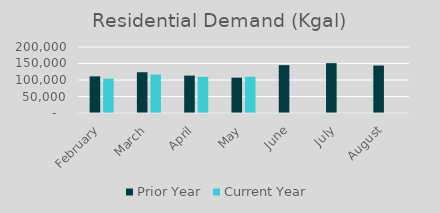
| Category | Prior Year | Current Year |
|---|---|---|
| February | 111009.962 | 104204.224 |
| March | 123525.131 | 116687.491 |
| April | 113258.787 | 109598.965 |
| May | 107128.051 | 109656.015 |
| June | 144930.453 | 0 |
| July | 151028.014 | 0 |
| August | 143816.337 | 0 |